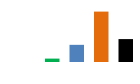
| Category | South |
|---|---|
| Chewbacca | 22433.584 |
| Hansolo | 113370.947 |
| James Kirk | 332804.564 |
| Luke Skywalker | 151266.34 |